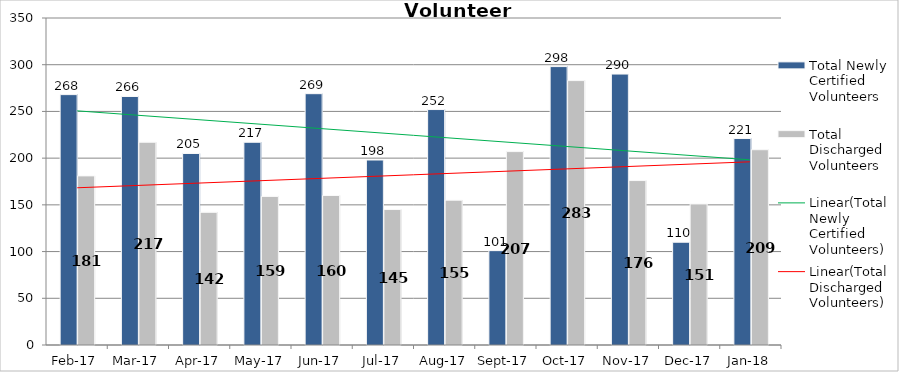
| Category | Total Newly Certified Volunteers | Total Discharged Volunteers |
|---|---|---|
| 2017-02-01 | 268 | 181 |
| 2017-03-01 | 266 | 217 |
| 2017-04-01 | 205 | 142 |
| 2017-05-01 | 217 | 159 |
| 2017-06-01 | 269 | 160 |
| 2017-07-01 | 198 | 145 |
| 2017-08-01 | 252 | 155 |
| 2017-09-01 | 101 | 207 |
| 2017-10-01 | 298 | 283 |
| 2017-11-01 | 290 | 176 |
| 2017-12-01 | 110 | 151 |
| 2018-01-01 | 221 | 209 |